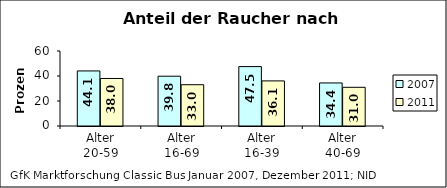
| Category | 2007 | 2011 |
|---|---|---|
| Alter
20-59 | 44.055 | 38.007 |
| Alter
16-69 | 39.833 | 33.026 |
| Alter
16-39 | 47.536 | 36.08 |
| Alter
40-69 | 34.448 | 30.957 |